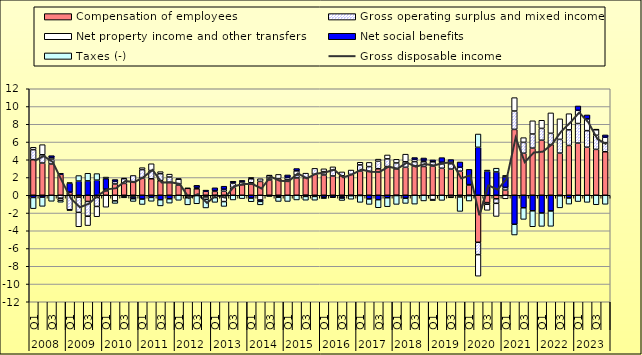
| Category | Compensation of employees | Gross operating surplus and mixed income | Net property income and other transfers | Net social benefits | Taxes (-) |
|---|---|---|---|---|---|
| 0 | 4.01 | 1.13 | 0.27 | -0.25 | -1.26 |
| 1 | 3.63 | 0.93 | 1.14 | -0.21 | -1.04 |
| 2 | 3.52 | 0.55 | 0.18 | 0.21 | -0.68 |
| 3 | 2.36 | -0.33 | -0.25 | 0.12 | -0.21 |
| 4 | 0.35 | -1.64 | -0.08 | 1.01 | 0.05 |
| 5 | -0.21 | -1.72 | -1.62 | 1.6 | 0.62 |
| 6 | -0.7 | -1.66 | -1.06 | 1.62 | 0.86 |
| 7 | -0.26 | -1 | -1.16 | 1.7 | 0.74 |
| 8 | 0.49 | 0.19 | -1.35 | 1.19 | 0.18 |
| 9 | 1.27 | 0.29 | -0.63 | 0.21 | -0.29 |
| 10 | 1.33 | 0.54 | 0.06 | -0.13 | -0.16 |
| 11 | 1.52 | 0.71 | -0.19 | -0.2 | -0.31 |
| 12 | 1.91 | 0.98 | 0.22 | -0.43 | -0.61 |
| 13 | 1.86 | 0.93 | 0.76 | -0.24 | -0.44 |
| 14 | 1.64 | 0.79 | 0.23 | -0.5 | -0.7 |
| 15 | 1.45 | 0.6 | 0.33 | -0.4 | -0.49 |
| 16 | 1.15 | 0.07 | 0.6 | 0.03 | -0.57 |
| 17 | 0.78 | -0.13 | -0.15 | 0.01 | -0.8 |
| 18 | 0.73 | -0.03 | 0.15 | 0.24 | -0.93 |
| 19 | 0.45 | -0.19 | -0.27 | 0.13 | -0.97 |
| 20 | 0.44 | 0.08 | -0.26 | 0.32 | -0.54 |
| 21 | 0.45 | 0.23 | -0.71 | 0.34 | -0.55 |
| 22 | 0.89 | 0.45 | 0.09 | 0.15 | -0.53 |
| 23 | 1.18 | 0.31 | 0.06 | 0.12 | -0.38 |
| 24 | 1.41 | 0.45 | 0.15 | -0.32 | -0.41 |
| 25 | 1.56 | 0.3 | -0.53 | -0.16 | -0.39 |
| 26 | 1.72 | 0.22 | 0.26 | 0.07 | -0.15 |
| 27 | 1.88 | -0.1 | 0.47 | -0.12 | -0.48 |
| 28 | 1.73 | 0.26 | 0.04 | 0.26 | -0.7 |
| 29 | 1.95 | 0.32 | 0.48 | 0.26 | -0.53 |
| 30 | 1.98 | 0.51 | -0.02 | -0.11 | -0.43 |
| 31 | 2.36 | 0.67 | -0.07 | -0.06 | -0.43 |
| 32 | 2.28 | 0.38 | 0.32 | -0.23 | -0.15 |
| 33 | 2.17 | 0.65 | 0.38 | -0.21 | -0.07 |
| 34 | 2.2 | 0.43 | -0.15 | -0.17 | -0.27 |
| 35 | 2.35 | 0.49 | -0.04 | -0.01 | -0.4 |
| 36 | 2.72 | 0.7 | 0.3 | -0.03 | -0.77 |
| 37 | 2.69 | 0.54 | 0.47 | -0.42 | -0.61 |
| 38 | 2.98 | 0.85 | 0.24 | -0.5 | -0.91 |
| 39 | 3.23 | 0.87 | 0.44 | -0.28 | -1.01 |
| 40 | 2.98 | 0.66 | 0.41 | -0.03 | -1 |
| 41 | 3.15 | 0.62 | 0.86 | -0.33 | -0.59 |
| 42 | 3.3 | 0.49 | 0.26 | 0.2 | -1 |
| 43 | 3.24 | 0.54 | 0.17 | 0.25 | -0.64 |
| 44 | 3.29 | 0.48 | -0.49 | 0.21 | -0.11 |
| 45 | 3.04 | 0.49 | 0.19 | 0.52 | -0.58 |
| 46 | 2.95 | 0.6 | -0.2 | 0.47 | -0.09 |
| 47 | 2.71 | 0.44 | -0.19 | 0.6 | -1.63 |
| 48 | 1.16 | -0.04 | 0.04 | 1.72 | -0.61 |
| 49 | -5.3 | -1.39 | -2.43 | 5.4 | 1.5 |
| 50 | -0.83 | -0.18 | -0.69 | 2.71 | 0.13 |
| 51 | -0.4 | -0.51 | -1.48 | 2.63 | 0.42 |
| 52 | 0.58 | 0.3 | -0.4 | 1.19 | 0.17 |
| 53 | 7.42 | 2.07 | 1.51 | -3.27 | -1.21 |
| 54 | 4.73 | 1.23 | 0.53 | -1.41 | -1.31 |
| 55 | 5.31 | 1.59 | 1.49 | -1.75 | -1.8 |
| 56 | 6.2 | 1.33 | 0.92 | -2 | -1.51 |
| 57 | 5.71 | 1.27 | 2.3 | -1.77 | -1.73 |
| 58 | 4.75 | 1.55 | 2.31 | -0.05 | -1.37 |
| 59 | 5.61 | 1.76 | 1.82 | -0.31 | -0.69 |
| 60 | 5.88 | 2.2 | 1.49 | 0.49 | -0.71 |
| 61 | 5.41 | 1.87 | 1.32 | 0.45 | -0.8 |
| 62 | 5.17 | 1.59 | 0.62 | 0.07 | -1.07 |
| 63 | 4.9 | 1.03 | 0.61 | 0.26 | -1.02 |